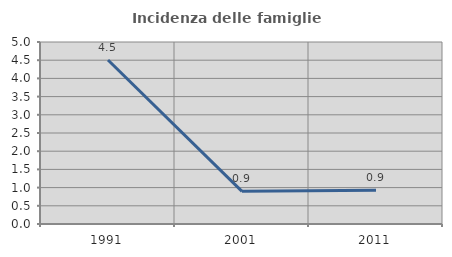
| Category | Incidenza delle famiglie numerose |
|---|---|
| 1991.0 | 4.505 |
| 2001.0 | 0.897 |
| 2011.0 | 0.93 |